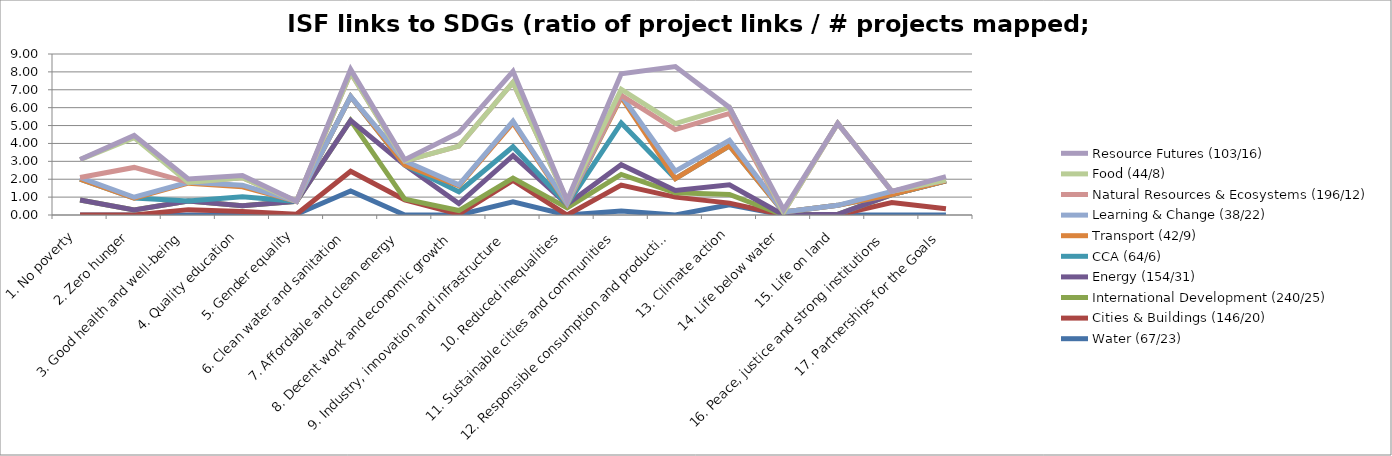
| Category | Water (67/23) | Cities & Buildings (146/20) | International Development (240/25) | Energy (154/31) | CCA (64/6) | Transport (42/9) | Learning & Change (38/22) | Natural Resources & Ecosystems (196/12) | Food (44/8) | Resource Futures (103/16) |
|---|---|---|---|---|---|---|---|---|---|---|
| 1. No poverty | 0 | 0 | 0.84 | 0 | 1.167 | 0 | 0.091 | 0 | 1 | 0 |
| 2. Zero hunger | 0 | 0 | 0.28 | 0 | 0.667 | 0 | 0.045 | 1.667 | 1.667 | 0.125 |
| 3. Good health and well-being | 0 | 0.3 | 0.48 | 0 | 0 | 1 | 0.045 | 0 | 0 | 0.188 |
| 4. Quality education | 0 | 0.2 | 0.32 | 0 | 0.5 | 0.556 | 0.091 | 0.417 | 0 | 0.125 |
| 5. Gender equality | 0.043 | 0 | 0.72 | 0 | 0 | 0 | 0 | 0 | 0 | 0 |
| 6. Clean water and sanitation | 1.348 | 1.1 | 2.84 | 0 | 1.333 | 0 | 0 | 1.333 | 0 | 0.188 |
| 7. Affordable and clean energy | 0 | 0.85 | 0.04 | 1.903 | 0 | 0 | 0.227 | 0 | 0 | 0.062 |
| 8. Decent work and economic growth | 0 | 0.05 | 0.2 | 0.387 | 0.667 | 0.333 | 0.045 | 2.167 | 0 | 0.75 |
| 9. Industry, innovation and infrastructure | 0.739 | 1.2 | 0.12 | 1.258 | 0.5 | 1.333 | 0.091 | 2.167 | 0 | 0.625 |
| 10. Reduced inequalities | 0 | 0 | 0.4 | 0.194 | 0 | 0 | 0.045 | 0.167 | 0 | 0 |
| 11. Sustainable cities and communities | 0.217 | 1.45 | 0.6 | 0.548 | 2.333 | 1.444 | 0.091 | 0 | 0.333 | 0.875 |
| 12. Responsible consumption and production | 0 | 1 | 0.24 | 0.129 | 0.667 | 0 | 0.409 | 2.333 | 0.333 | 3.188 |
| 13. Climate action | 0.565 | 0.1 | 0.48 | 0.548 | 2.167 | 0 | 0.318 | 1.5 | 0.333 | 0 |
| 14. Life below water | 0 | 0 | 0 | 0 | 0.167 | 0 | 0 | 0 | 0 | 0.125 |
| 15. Life on land | 0 | 0 | 0.04 | 0 | 0.5 | 0 | 0 | 4.583 | 0 | 0 |
| 16. Peace, justice and strong institutions | 0 | 0.7 | 0.44 | 0 | 0 | 0 | 0.182 | 0 | 0 | 0 |
| 17. Partnerships for the Goals | 0 | 0.35 | 1.56 | 0 | 0 | 0 | 0.045 | 0 | 0 | 0.188 |